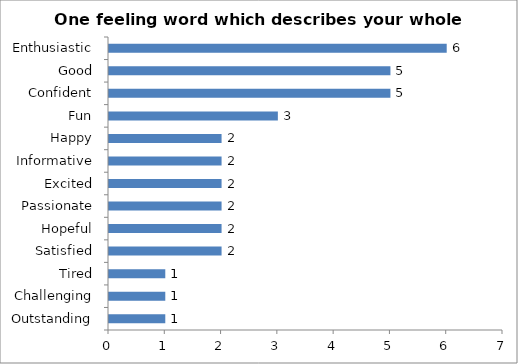
| Category | One feeling word which describes your whole experience. |
|---|---|
| Outstanding | 1 |
| Challenging | 1 |
| Tired | 1 |
| Satisfied | 2 |
| Hopeful | 2 |
| Passionate | 2 |
| Excited | 2 |
| Informative | 2 |
| Happy | 2 |
| Fun | 3 |
| Confident | 5 |
| Good | 5 |
| Enthusiastic | 6 |